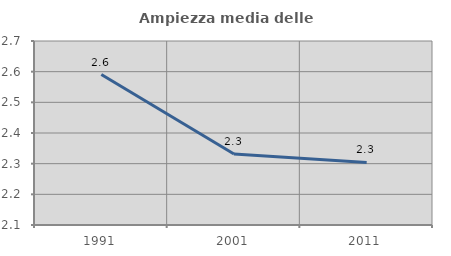
| Category | Ampiezza media delle famiglie |
|---|---|
| 1991.0 | 2.591 |
| 2001.0 | 2.332 |
| 2011.0 | 2.304 |